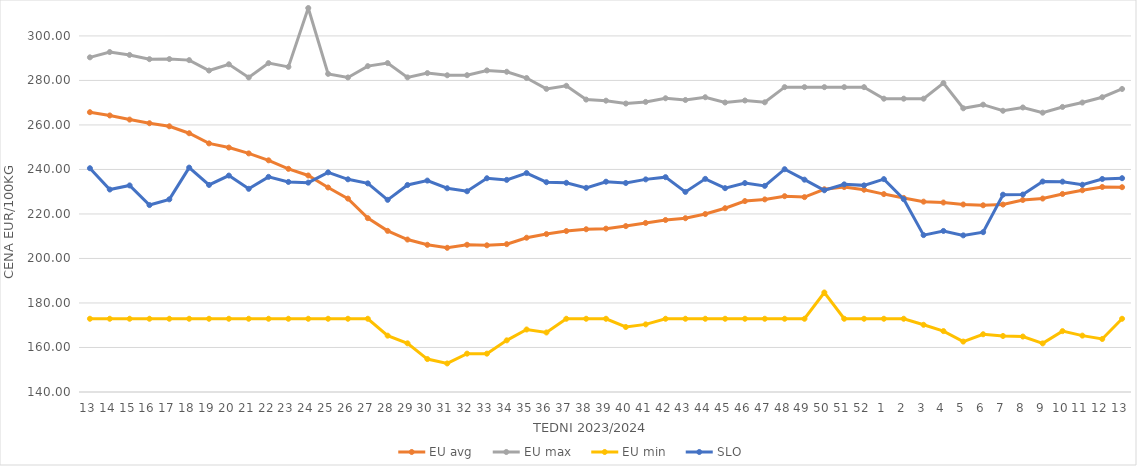
| Category | EU avg | EU max | EU min | SLO |
|---|---|---|---|---|
| 13.0 | 265.73 | 290.38 | 172.91 | 240.55 |
| 14.0 | 264.262 | 292.763 | 172.91 | 230.99 |
| 15.0 | 262.411 | 291.46 | 172.91 | 232.82 |
| 16.0 | 260.77 | 289.56 | 172.91 | 224 |
| 17.0 | 259.395 | 289.61 | 172.91 | 226.57 |
| 18.0 | 256.275 | 289.13 | 172.91 | 240.83 |
| 19.0 | 251.716 | 284.45 | 172.91 | 233.05 |
| 20.0 | 249.836 | 287.26 | 172.91 | 237.25 |
| 21.0 | 247.212 | 281.33 | 172.91 | 231.3 |
| 22.0 | 244.103 | 287.77 | 172.91 | 236.67 |
| 23.0 | 240.279 | 286.1 | 172.91 | 234.39 |
| 24.0 | 237.289 | 312.54 | 172.91 | 234.08 |
| 25.0 | 231.895 | 282.95 | 172.91 | 238.69 |
| 26.0 | 226.903 | 281.34 | 172.91 | 235.57 |
| 27.0 | 218.126 | 286.43 | 172.91 | 233.75 |
| 28.0 | 212.406 | 287.8 | 165.32 | 226.35 |
| 29.0 | 208.504 | 281.37 | 161.87 | 233.03 |
| 30.0 | 206.149 | 283.3 | 154.8 | 235 |
| 31.0 | 204.79 | 282.32 | 152.83 | 231.55 |
| 32.0 | 206.16 | 282.36 | 157.23 | 230.2 |
| 33.0 | 205.917 | 284.5 | 157.23 | 236.04 |
| 34.0 | 206.436 | 283.9 | 163.21 | 235.32 |
| 35.0 | 209.326 | 281.09 | 168.085 | 238.39 |
| 36.0 | 210.957 | 276.21 | 166.745 | 234.27 |
| 37.0 | 212.325 | 277.59 | 172.91 | 234 |
| 38.0 | 213.132 | 271.4 | 172.91 | 231.74 |
| 39.0 | 213.398 | 270.91 | 172.91 | 234.5 |
| 40.0 | 214.548 | 269.62 | 169.209 | 233.92 |
| 41.0 | 215.966 | 270.36 | 170.387 | 235.54 |
| 42.0 | 217.294 | 271.99 | 172.91 | 236.54 |
| 43.0 | 218.091 | 271.22 | 172.91 | 229.92 |
| 44.0 | 219.965 | 272.45 | 172.91 | 235.77 |
| 45.0 | 222.584 | 270.09 | 172.91 | 231.6 |
| 46.0 | 225.795 | 270.99 | 172.91 | 233.89 |
| 47.0 | 226.547 | 270.18 | 172.91 | 232.62 |
| 48.0 | 227.993 | 276.99 | 172.91 | 240.11 |
| 49.0 | 227.575 | 276.99 | 172.91 | 235.41 |
| 50.0 | 231.099 | 276.99 | 184.72 | 230.65 |
| 51.0 | 232.088 | 276.99 | 172.91 | 233.3 |
| 52.0 | 230.884 | 276.99 | 172.91 | 232.85 |
| 1.0 | 228.928 | 271.8 | 172.91 | 235.66 |
| 2.0 | 227.213 | 271.8 | 172.91 | 226.65 |
| 3.0 | 225.533 | 271.8 | 170.2 | 210.5 |
| 4.0 | 225.142 | 278.81 | 167.37 | 212.37 |
| 5.0 | 224.262 | 267.49 | 162.66 | 210.38 |
| 6.0 | 223.902 | 269.11 | 165.95 | 211.82 |
| 7.0 | 224.231 | 266.38 | 165.18 | 228.66 |
| 8.0 | 226.285 | 267.85 | 164.92 | 228.73 |
| 9.0 | 226.925 | 265.51 | 161.84 | 234.57 |
| 10.0 | 228.992 | 268.09 | 167.35 | 234.52 |
| 11.0 | 230.655 | 270.07 | 165.34 | 233.13 |
| 12.0 | 232.129 | 272.46 | 163.83 | 235.73 |
| 13.0 | 232.031 | 276.17 | 172.91 | 236.07 |